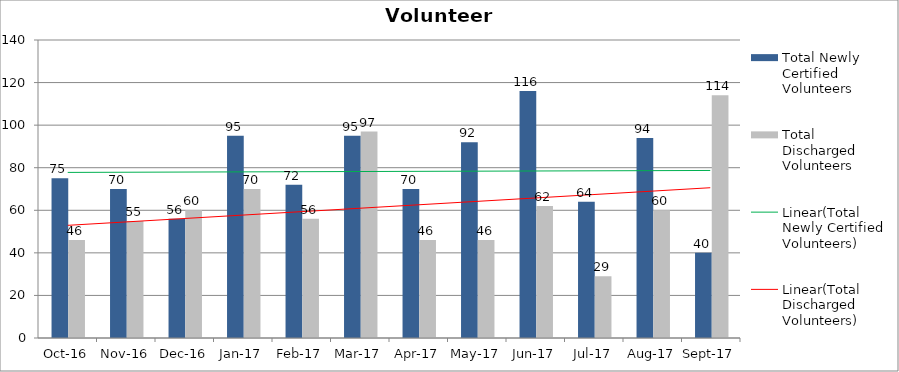
| Category | Total Newly Certified Volunteers | Total Discharged Volunteers |
|---|---|---|
| 2016-10-01 | 75 | 46 |
| 2016-11-01 | 70 | 55 |
| 2016-12-01 | 56 | 60 |
| 2017-01-01 | 95 | 70 |
| 2017-02-01 | 72 | 56 |
| 2017-03-01 | 95 | 97 |
| 2017-04-01 | 70 | 46 |
| 2017-05-01 | 92 | 46 |
| 2017-06-01 | 116 | 62 |
| 2017-07-01 | 64 | 29 |
| 2017-08-01 | 94 | 60 |
| 2017-09-01 | 40 | 114 |